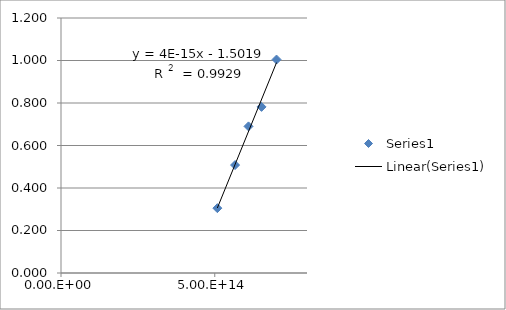
| Category | Series 0 |
|---|---|
| 700934579439252.2 | 1.004 |
| 652173913043478.2 | 0.782 |
| 609756097560975.6 | 0.69 |
| 566037735849056.6 | 0.508 |
| 508474576271186.4 | 0.305 |
| nan | 0.979 |